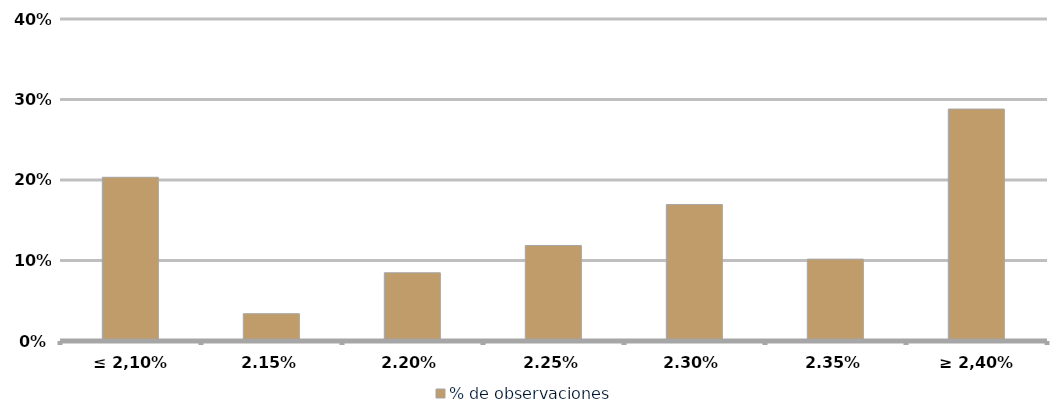
| Category | % de observaciones  |
|---|---|
| ≤ 2,10% | 0.203 |
| 2,15% | 0.034 |
| 2,20% | 0.085 |
| 2,25% | 0.119 |
| 2,30% | 0.169 |
| 2,35% | 0.102 |
| ≥ 2,40% | 0.288 |